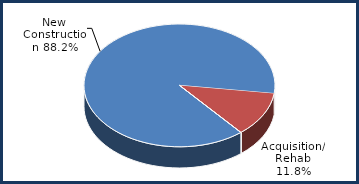
| Category | Series 0 |
|---|---|
| New Construction | 0.882 |
| Acquisition/ Rehab | 0.118 |
| Adaptive/ Rehab | 0 |
| Refinance/ Rehab | 0 |